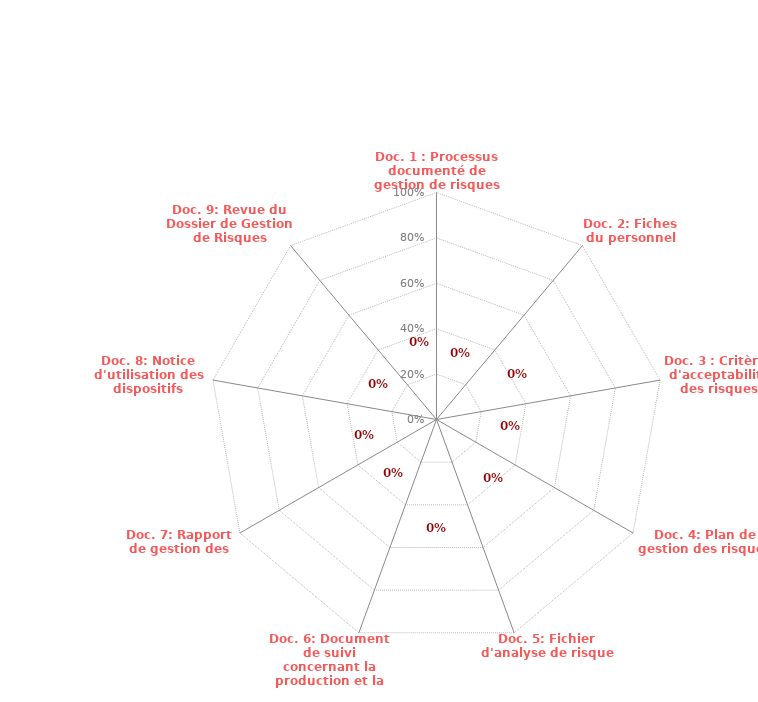
| Category | Doc. 1 : Processus documenté de gestion de risques Doc. 2: Fiches du personnel Doc. 3 : Critères d'acceptabilité des risques Doc. 4: Plan de gestion des risques Doc. 5: Fichier d'analyse de risque Doc. 6: Document de suivi concernant la production et la p |
|---|---|
| Doc. 1 : Processus documenté de gestion de risques | 0 |
| Doc. 2: Fiches du personnel | 0 |
| Doc. 3 : Critères d'acceptabilité des risques | 0 |
| Doc. 4: Plan de gestion des risques | 0 |
| Doc. 5: Fichier d'analyse de risque | 0 |
| Doc. 6: Document de suivi concernant la production et la postproduction | 0 |
| Doc. 7: Rapport de gestion des risques | 0 |
| Doc. 8: Notice d'utilisation des dispositifs médicaux | 0 |
| Doc. 9: Revue du Dossier de Gestion de Risques | 0 |